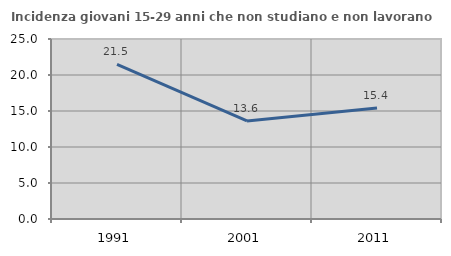
| Category | Incidenza giovani 15-29 anni che non studiano e non lavorano  |
|---|---|
| 1991.0 | 21.471 |
| 2001.0 | 13.612 |
| 2011.0 | 15.417 |